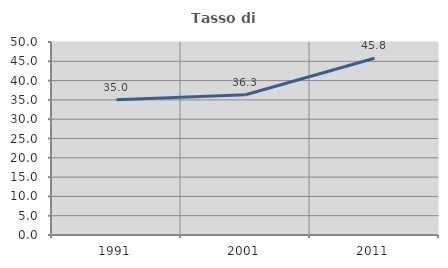
| Category | Tasso di occupazione   |
|---|---|
| 1991.0 | 35.039 |
| 2001.0 | 36.35 |
| 2011.0 | 45.803 |